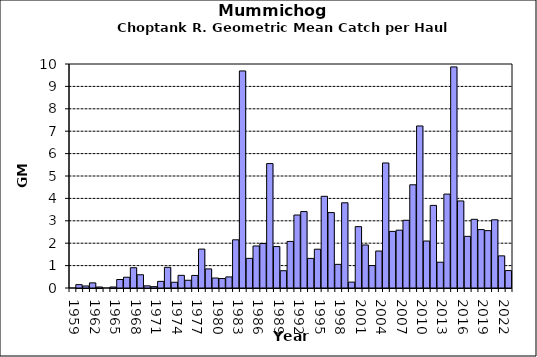
| Category | Series 0 |
|---|---|
| 1959.0 | 0 |
| 1960.0 | 0.149 |
| 1961.0 | 0.091 |
| 1962.0 | 0.229 |
| 1963.0 | 0.044 |
| 1964.0 | 0 |
| 1965.0 | 0.044 |
| 1966.0 | 0.379 |
| 1967.0 | 0.48 |
| 1968.0 | 0.905 |
| 1969.0 | 0.592 |
| 1970.0 | 0.096 |
| 1971.0 | 0.059 |
| 1972.0 | 0.296 |
| 1973.0 | 0.922 |
| 1974.0 | 0.257 |
| 1975.0 | 0.566 |
| 1976.0 | 0.346 |
| 1977.0 | 0.561 |
| 1978.0 | 1.736 |
| 1979.0 | 0.853 |
| 1980.0 | 0.445 |
| 1981.0 | 0.421 |
| 1982.0 | 0.495 |
| 1983.0 | 2.151 |
| 1984.0 | 9.69 |
| 1985.0 | 1.323 |
| 1986.0 | 1.876 |
| 1987.0 | 1.987 |
| 1988.0 | 5.555 |
| 1989.0 | 1.85 |
| 1990.0 | 0.772 |
| 1991.0 | 2.08 |
| 1992.0 | 3.258 |
| 1993.0 | 3.411 |
| 1994.0 | 1.321 |
| 1995.0 | 1.732 |
| 1996.0 | 4.093 |
| 1997.0 | 3.367 |
| 1998.0 | 1.056 |
| 1999.0 | 3.805 |
| 2000.0 | 0.263 |
| 2001.0 | 2.74 |
| 2002.0 | 1.92 |
| 2003.0 | 1.001 |
| 2004.0 | 1.65 |
| 2005.0 | 5.581 |
| 2006.0 | 2.527 |
| 2007.0 | 2.582 |
| 2008.0 | 3.024 |
| 2009.0 | 4.607 |
| 2010.0 | 7.234 |
| 2011.0 | 2.097 |
| 2012.0 | 3.688 |
| 2013.0 | 1.151 |
| 2014.0 | 4.192 |
| 2015.0 | 9.87 |
| 2016.0 | 3.887 |
| 2017.0 | 2.306 |
| 2018.0 | 3.067 |
| 2019.0 | 2.608 |
| 2020.0 | 2.56 |
| 2021.0 | 3.045 |
| 2022.0 | 1.435 |
| 2023.0 | 0.778 |